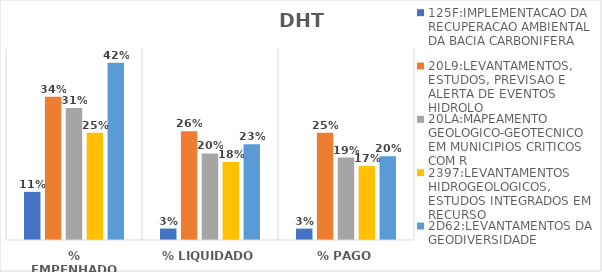
| Category | 125F:IMPLEMENTACAO DA RECUPERACAO AMBIENTAL DA BACIA CARBONIFERA | 20L9:LEVANTAMENTOS, ESTUDOS, PREVISAO E ALERTA DE EVENTOS HIDROLO | 20LA:MAPEAMENTO GEOLOGICO-GEOTECNICO EM MUNICIPIOS CRITICOS COM R | 2397:LEVANTAMENTOS HIDROGEOLOGICOS, ESTUDOS INTEGRADOS EM RECURSO | 2D62:LEVANTAMENTOS DA GEODIVERSIDADE |
|---|---|---|---|---|---|
| % EMPENHADO | 0.113 | 0.338 | 0.311 | 0.253 | 0.417 |
| % LIQUIDADO | 0.027 | 0.256 | 0.204 | 0.184 | 0.226 |
| % PAGO | 0.027 | 0.252 | 0.194 | 0.174 | 0.197 |